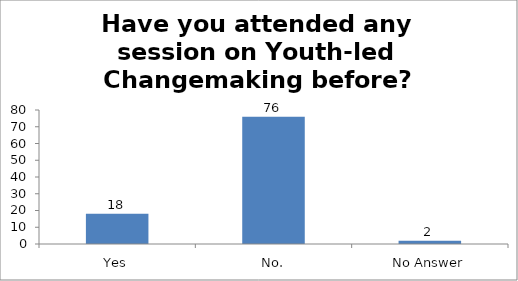
| Category | Have you attended any session on Youth-led Changemaking before? |
|---|---|
| Yes | 18 |
| No. | 76 |
| No Answer | 2 |